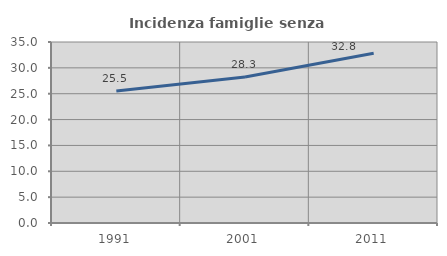
| Category | Incidenza famiglie senza nuclei |
|---|---|
| 1991.0 | 25.51 |
| 2001.0 | 28.251 |
| 2011.0 | 32.836 |